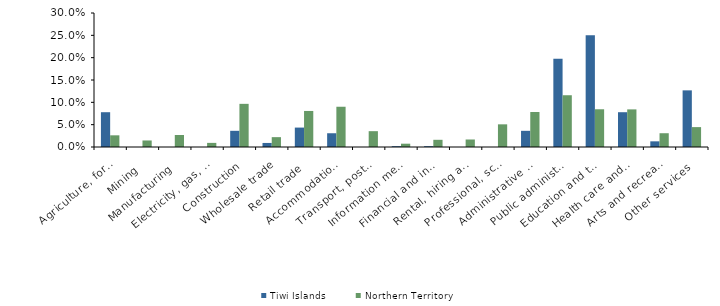
| Category | Tiwi Islands | Northern Territory |
|---|---|---|
| Agriculture, forestry and fishing | 0.078 | 0.026 |
| Mining | 0 | 0.015 |
| Manufacturing | 0 | 0.027 |
| Electricity, gas, water and waste services | 0 | 0.009 |
| Construction | 0.036 | 0.097 |
| Wholesale trade | 0.009 | 0.022 |
| Retail trade | 0.043 | 0.081 |
| Accommodation and food services | 0.031 | 0.09 |
| Transport, postal and warehousing | 0 | 0.035 |
| Information media and telecommunications | 0.002 | 0.007 |
| Financial and insurance services | 0.002 | 0.016 |
| Rental, hiring and real estate services | 0 | 0.017 |
| Professional, scientific and technical services | 0 | 0.051 |
| Administrative and support services | 0.036 | 0.078 |
| Public administration and safety | 0.197 | 0.116 |
| Education and training | 0.25 | 0.084 |
| Health care and social assistance | 0.078 | 0.084 |
| Arts and recreation services | 0.013 | 0.031 |
| Other services | 0.127 | 0.045 |